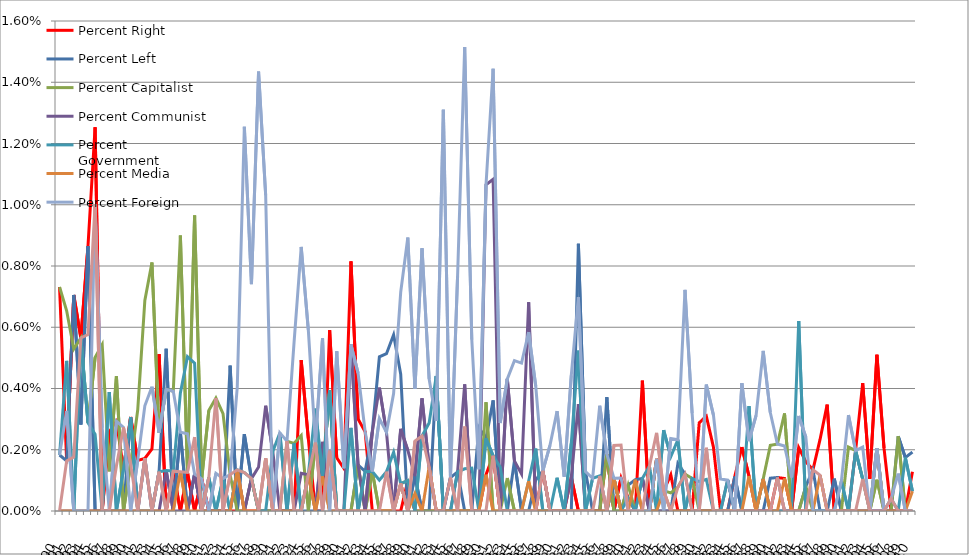
| Category | Percent Right | Percent Left | Percent Capitalist | Percent Communist | Percent Government | Percent Media | Percent Foreign | Percent Other |
|---|---|---|---|---|---|---|---|---|
| 1890.0 | 0.007 | 0.002 | 0.007 | 0 | 0.002 | 0 | 0.002 | 0 |
| 1891.0 | 0.002 | 0.002 | 0.007 | 0 | 0.005 | 0 | 0.003 | 0.002 |
| 1892.0 | 0.007 | 0.007 | 0.005 | 0 | 0 | 0 | 0 | 0.002 |
| 1893.0 | 0.006 | 0.003 | 0.006 | 0 | 0.006 | 0 | 0 | 0.006 |
| 1894.0 | 0.009 | 0.009 | 0.003 | 0 | 0.003 | 0 | 0 | 0.006 |
| 1895.0 | 0.013 | 0 | 0.005 | 0 | 0.003 | 0 | 0.01 | 0.01 |
| 1896.0 | 0 | 0 | 0.005 | 0 | 0 | 0 | 0.003 | 0 |
| 1897.0 | 0.003 | 0 | 0.001 | 0 | 0.004 | 0 | 0 | 0 |
| 1898.0 | 0.003 | 0 | 0.004 | 0 | 0 | 0 | 0.003 | 0.001 |
| 1899.0 | 0.001 | 0 | 0 | 0 | 0.001 | 0 | 0.003 | 0.003 |
| 1900.0 | 0.003 | 0.003 | 0.002 | 0 | 0.003 | 0 | 0 | 0.002 |
| 1901.0 | 0.002 | 0 | 0.003 | 0 | 0 | 0 | 0.002 | 0 |
| 1902.0 | 0.002 | 0.002 | 0.007 | 0 | 0 | 0 | 0.003 | 0.002 |
| 1903.0 | 0.002 | 0 | 0.008 | 0 | 0 | 0 | 0.004 | 0 |
| 1904.0 | 0.005 | 0.001 | 0.003 | 0 | 0.001 | 0 | 0.003 | 0.001 |
| 1905.0 | 0 | 0.005 | 0.004 | 0.001 | 0.001 | 0 | 0.004 | 0 |
| 1906.0 | 0.001 | 0 | 0.004 | 0 | 0.001 | 0 | 0.004 | 0.001 |
| 1907.0 | 0 | 0.003 | 0.009 | 0 | 0.004 | 0.001 | 0.003 | 0.001 |
| 1908.0 | 0.001 | 0 | 0.001 | 0 | 0.005 | 0 | 0.003 | 0.001 |
| 1909.0 | 0 | 0.001 | 0.01 | 0.001 | 0.005 | 0 | 0.001 | 0.002 |
| 1910.0 | 0.001 | 0 | 0.001 | 0 | 0 | 0 | 0.001 | 0 |
| 1911.0 | 0 | 0 | 0.003 | 0 | 0.001 | 0 | 0 | 0.001 |
| 1912.0 | 0 | 0 | 0.004 | 0 | 0 | 0 | 0.001 | 0.004 |
| 1913.0 | 0 | 0 | 0.003 | 0 | 0.001 | 0 | 0.001 | 0 |
| 1914.0 | 0 | 0.005 | 0.001 | 0 | 0 | 0 | 0.001 | 0.001 |
| 1915.0 | 0 | 0 | 0 | 0.001 | 0.001 | 0.001 | 0.004 | 0.001 |
| 1916.0 | 0 | 0.003 | 0 | 0 | 0.001 | 0 | 0.013 | 0.001 |
| 1917.0 | 0 | 0.001 | 0.001 | 0.001 | 0.001 | 0 | 0.007 | 0.001 |
| 1918.0 | 0 | 0 | 0 | 0.001 | 0 | 0 | 0.014 | 0 |
| 1919.0 | 0 | 0 | 0 | 0.003 | 0 | 0.002 | 0.01 | 0.002 |
| 1920.0 | 0 | 0 | 0 | 0.002 | 0.002 | 0 | 0 | 0 |
| 1921.0 | 0 | 0 | 0 | 0 | 0.003 | 0 | 0.003 | 0 |
| 1922.0 | 0 | 0 | 0.002 | 0 | 0 | 0 | 0.002 | 0.002 |
| 1923.0 | 0 | 0 | 0.002 | 0 | 0.002 | 0 | 0.006 | 0 |
| 1924.0 | 0.005 | 0 | 0.002 | 0.001 | 0 | 0 | 0.009 | 0 |
| 1925.0 | 0.002 | 0 | 0 | 0.001 | 0.001 | 0.001 | 0.006 | 0.001 |
| 1926.0 | 0 | 0 | 0.002 | 0 | 0.003 | 0 | 0.002 | 0.002 |
| 1927.0 | 0 | 0 | 0.001 | 0.002 | 0.001 | 0.001 | 0.006 | 0 |
| 1928.0 | 0.006 | 0.002 | 0.004 | 0 | 0.004 | 0 | 0 | 0.002 |
| 1929.0 | 0.002 | 0 | 0 | 0 | 0 | 0 | 0.005 | 0 |
| 1930.0 | 0.001 | 0 | 0 | 0 | 0 | 0 | 0.001 | 0 |
| 1931.0 | 0.008 | 0 | 0 | 0.005 | 0.003 | 0 | 0.005 | 0 |
| 1932.0 | 0.003 | 0.002 | 0.002 | 0.002 | 0 | 0 | 0.005 | 0 |
| 1933.0 | 0.003 | 0.001 | 0 | 0 | 0.001 | 0 | 0.003 | 0 |
| 1934.0 | 0 | 0.003 | 0.001 | 0.003 | 0.001 | 0 | 0.001 | 0 |
| 1935.0 | 0 | 0.005 | 0 | 0.004 | 0.001 | 0 | 0.003 | 0 |
| 1936.0 | 0 | 0.005 | 0 | 0.003 | 0.001 | 0 | 0.003 | 0.001 |
| 1937.0 | 0 | 0.006 | 0 | 0 | 0.002 | 0 | 0.004 | 0 |
| 1938.0 | 0 | 0.004 | 0.001 | 0.003 | 0.001 | 0.001 | 0.007 | 0.001 |
| 1939.0 | 0.001 | 0 | 0.001 | 0.002 | 0.001 | 0 | 0.009 | 0 |
| 1940.0 | 0 | 0.001 | 0 | 0.001 | 0 | 0.001 | 0.004 | 0.002 |
| 1941.0 | 0 | 0 | 0 | 0.004 | 0.002 | 0 | 0.009 | 0.002 |
| 1942.0 | 0 | 0 | 0 | 0.001 | 0.003 | 0.001 | 0.004 | 0.001 |
| 1943.0 | 0 | 0.004 | 0 | 0 | 0.004 | 0 | 0.003 | 0 |
| 1944.0 | 0 | 0 | 0 | 0 | 0 | 0 | 0.013 | 0 |
| 1945.0 | 0 | 0.001 | 0 | 0 | 0 | 0 | 0.001 | 0.001 |
| 1946.0 | 0 | 0.001 | 0 | 0.001 | 0.001 | 0 | 0.008 | 0 |
| 1947.0 | 0 | 0 | 0 | 0.004 | 0.001 | 0 | 0.015 | 0.003 |
| 1948.0 | 0 | 0 | 0 | 0 | 0.001 | 0 | 0.006 | 0 |
| 1949.0 | 0 | 0.003 | 0 | 0 | 0 | 0 | 0.001 | 0 |
| 1950.0 | 0.001 | 0.002 | 0.004 | 0.011 | 0.002 | 0.001 | 0.011 | 0 |
| 1951.0 | 0.002 | 0.004 | 0 | 0.011 | 0.002 | 0 | 0.014 | 0.002 |
| 1952.0 | 0 | 0 | 0 | 0 | 0.001 | 0 | 0.003 | 0 |
| 1953.0 | 0 | 0 | 0.001 | 0.004 | 0 | 0 | 0.004 | 0 |
| 1954.0 | 0 | 0.002 | 0 | 0.002 | 0 | 0 | 0.005 | 0 |
| 1955.0 | 0 | 0 | 0 | 0.001 | 0 | 0 | 0.005 | 0 |
| 1956.0 | 0 | 0 | 0 | 0.007 | 0.001 | 0.001 | 0.006 | 0 |
| 1957.0 | 0 | 0.001 | 0 | 0 | 0.002 | 0 | 0.004 | 0 |
| 1958.0 | 0.001 | 0.001 | 0 | 0 | 0 | 0 | 0.001 | 0.001 |
| 1959.0 | 0 | 0 | 0 | 0 | 0 | 0 | 0.002 | 0 |
| 1960.0 | 0 | 0 | 0 | 0 | 0.001 | 0 | 0.003 | 0 |
| 1961.0 | 0 | 0 | 0 | 0 | 0 | 0 | 0.001 | 0 |
| 1962.0 | 0.001 | 0 | 0 | 0.001 | 0.002 | 0 | 0.004 | 0 |
| 1963.0 | 0 | 0.009 | 0 | 0.003 | 0.005 | 0 | 0.007 | 0 |
| 1964.0 | 0 | 0.001 | 0 | 0 | 0 | 0 | 0.001 | 0 |
| 1965.0 | 0 | 0 | 0 | 0 | 0.001 | 0 | 0.001 | 0 |
| 1966.0 | 0 | 0 | 0 | 0 | 0.001 | 0 | 0.003 | 0.001 |
| 1967.0 | 0.002 | 0.004 | 0.002 | 0 | 0 | 0 | 0.002 | 0 |
| 1968.0 | 0 | 0 | 0 | 0.001 | 0.001 | 0.001 | 0.001 | 0.002 |
| 1969.0 | 0.001 | 0 | 0 | 0 | 0 | 0 | 0.001 | 0.002 |
| 1970.0 | 0 | 0.001 | 0.001 | 0 | 0 | 0 | 0 | 0 |
| 1971.0 | 0 | 0.001 | 0 | 0 | 0 | 0.001 | 0 | 0 |
| 1972.0 | 0.004 | 0.001 | 0 | 0.001 | 0.001 | 0 | 0 | 0 |
| 1973.0 | 0 | 0 | 0 | 0 | 0.001 | 0 | 0 | 0.001 |
| 1974.0 | 0.002 | 0 | 0.002 | 0 | 0 | 0 | 0.002 | 0.003 |
| 1975.0 | 0.001 | 0 | 0.001 | 0 | 0.003 | 0.001 | 0 | 0.001 |
| 1976.0 | 0.001 | 0 | 0.001 | 0 | 0.002 | 0 | 0.002 | 0 |
| 1977.0 | 0 | 0.002 | 0.001 | 0 | 0.002 | 0 | 0.002 | 0.001 |
| 1978.0 | 0 | 0.001 | 0.001 | 0 | 0 | 0 | 0.007 | 0.001 |
| 1979.0 | 0 | 0 | 0.001 | 0 | 0.001 | 0 | 0.003 | 0 |
| 1980.0 | 0.003 | 0 | 0 | 0 | 0.001 | 0 | 0 | 0 |
| 1981.0 | 0.003 | 0 | 0 | 0 | 0.001 | 0 | 0.004 | 0.002 |
| 1982.0 | 0.002 | 0 | 0 | 0 | 0 | 0 | 0.003 | 0 |
| 1983.0 | 0 | 0 | 0 | 0 | 0 | 0 | 0.001 | 0 |
| 1984.0 | 0 | 0 | 0 | 0.001 | 0.001 | 0 | 0.001 | 0 |
| 1985.0 | 0.001 | 0.001 | 0 | 0 | 0 | 0 | 0 | 0 |
| 1986.0 | 0.002 | 0 | 0 | 0 | 0 | 0 | 0.004 | 0 |
| 1987.0 | 0.001 | 0 | 0 | 0 | 0.003 | 0.001 | 0.002 | 0 |
| 1988.0 | 0 | 0 | 0 | 0 | 0 | 0 | 0.003 | 0 |
| 1989.0 | 0 | 0 | 0.001 | 0 | 0.001 | 0.001 | 0.005 | 0 |
| 1990.0 | 0 | 0.001 | 0.002 | 0 | 0 | 0 | 0.003 | 0 |
| 1991.0 | 0.001 | 0.001 | 0.002 | 0 | 0 | 0 | 0.002 | 0.001 |
| 1992.0 | 0.001 | 0 | 0.003 | 0 | 0 | 0.001 | 0.002 | 0 |
| 1993.0 | 0 | 0 | 0 | 0 | 0 | 0 | 0.001 | 0 |
| 1994.0 | 0.002 | 0 | 0 | 0 | 0.006 | 0 | 0.003 | 0 |
| 1995.0 | 0.002 | 0.001 | 0.001 | 0 | 0 | 0 | 0.002 | 0 |
| 1996.0 | 0.001 | 0.001 | 0 | 0 | 0 | 0 | 0 | 0.001 |
| 1997.0 | 0.002 | 0 | 0 | 0 | 0 | 0.001 | 0 | 0.001 |
| 1998.0 | 0.003 | 0 | 0 | 0 | 0 | 0 | 0 | 0 |
| 1999.0 | 0 | 0.001 | 0 | 0 | 0 | 0 | 0 | 0 |
| 2000.0 | 0 | 0 | 0 | 0 | 0.001 | 0 | 0.001 | 0 |
| 2001.0 | 0 | 0 | 0.002 | 0 | 0 | 0 | 0.003 | 0 |
| 2002.0 | 0.002 | 0 | 0.002 | 0 | 0.002 | 0 | 0.002 | 0 |
| 2003.0 | 0.004 | 0 | 0.001 | 0 | 0.001 | 0 | 0.002 | 0.001 |
| 2004.0 | 0.001 | 0 | 0 | 0 | 0 | 0 | 0 | 0 |
| 2005.0 | 0.005 | 0 | 0.001 | 0 | 0.002 | 0.002 | 0.002 | 0 |
| 2006.0 | 0.002 | 0 | 0 | 0 | 0 | 0 | 0 | 0 |
| 2007.0 | 0 | 0 | 0 | 0 | 0 | 0 | 0 | 0 |
| 2008.0 | 0 | 0.002 | 0.002 | 0 | 0 | 0 | 0.001 | 0 |
| 2009.0 | 0 | 0.002 | 0 | 0 | 0.002 | 0 | 0 | 0 |
| 2010.0 | 0.001 | 0.002 | 0 | 0 | 0.001 | 0.001 | 0 | 0 |